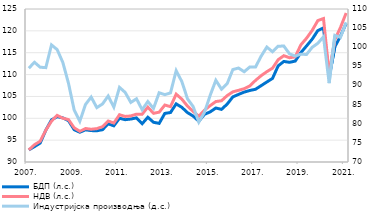
| Category | БДП (л.с.) | НДВ (л.с.) |
|---|---|---|
| 2007. | 92.769 | 92.764 |
| II | 93.531 | 93.958 |
| III | 94.327 | 94.738 |
| IV | 97.287 | 97.285 |
| 2008. | 99.637 | 99.347 |
| II | 100.363 | 100.653 |
| III | 100.09 | 100.02 |
| IV | 99.463 | 99.693 |
| 2009. | 97.39 | 97.82 |
| II | 96.81 | 97.017 |
| III | 97.364 | 97.657 |
| IV | 97.185 | 97.494 |
| 2010. | 97.141 | 97.629 |
| II | 97.393 | 98.081 |
| III | 98.725 | 99.386 |
| IV | 98.282 | 98.908 |
| 2011. | 100.008 | 100.814 |
| II | 99.679 | 100.421 |
| III | 99.834 | 100.537 |
| IV | 100.094 | 100.949 |
| 2012. | 98.756 | 100.943 |
| II | 100.237 | 102.542 |
| III | 99.086 | 101.133 |
| IV | 98.834 | 101.399 |
| 2013. | 101.117 | 103.027 |
| II | 101.317 | 102.659 |
| III | 103.295 | 105.518 |
| IV | 102.503 | 104.383 |
| 2014. | 101.299 | 102.779 |
| II | 100.5 | 101.573 |
| III | 99.315 | 100.481 |
| IV | 100.909 | 101.869 |
| 2015. | 101.462 | 102.896 |
| II | 102.35 | 103.826 |
| III | 102.041 | 104.008 |
| IV | 103.242 | 105.19 |
| 2016. | 104.89 | 106.043 |
| II | 105.459 | 106.394 |
| III | 105.992 | 106.773 |
| IV | 106.361 | 107.414 |
| 2017. | 106.639 | 108.665 |
| II | 107.466 | 109.749 |
| III | 108.304 | 110.663 |
| IV | 109.117 | 111.465 |
| 2018. | 111.986 | 113.4 |
| II | 113.006 | 114.32 |
| III | 112.805 | 113.851 |
| IV | 113.077 | 114.044 |
| 2019. | 115.016 | 116.792 |
| II | 116.535 | 118.302 |
| III | 118.097 | 120.099 |
| IV | 120.063 | 122.351 |
| 2020. | 120.675 | 122.82 |
| II | 109.422 | 110.178 |
| III | 116.35 | 117.985 |
| IV | 118.776 | 120.807 |
| 2021. | 121.687 | 124.078 |